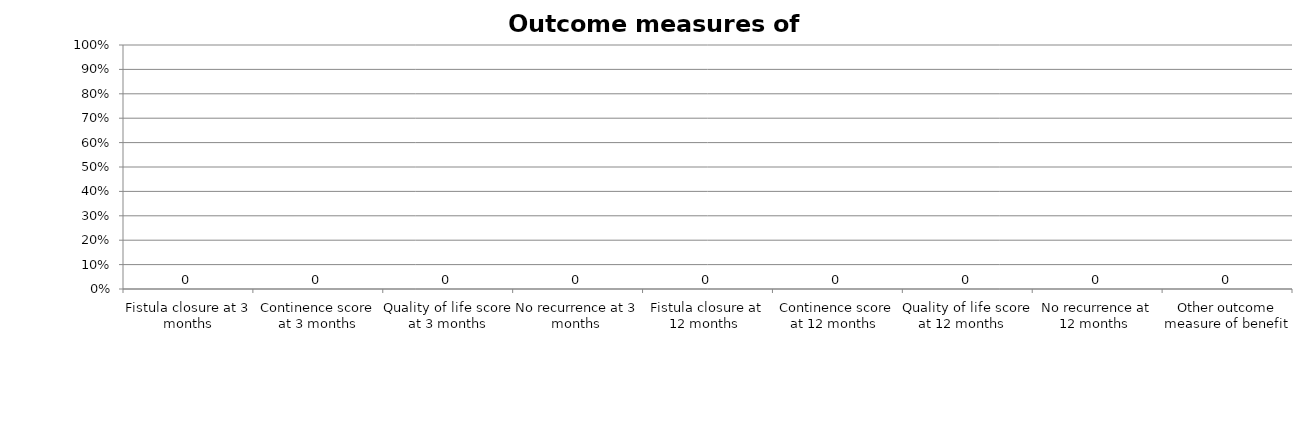
| Category | Series 0 |
|---|---|
| Fistula closure at 3 months | 0 |
| Continence score at 3 months | 0 |
| Quality of life score at 3 months | 0 |
| No recurrence at 3 months  | 0 |
| Fistula closure at 12 months  | 0 |
| Continence score at 12 months  | 0 |
| Quality of life score at 12 months   | 0 |
| No recurrence at 12 months  | 0 |
| Other outcome measure of benefit | 0 |